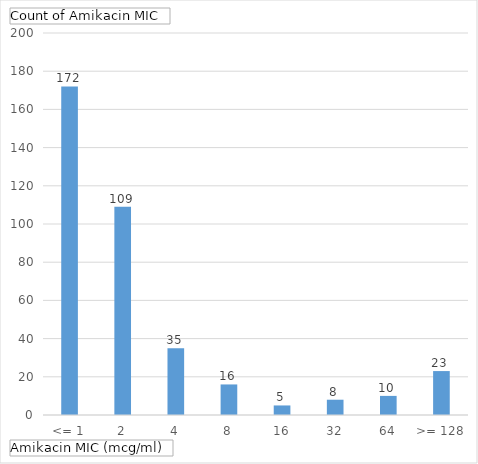
| Category | Total |
|---|---|
| <= 1 | 172 |
| 2 | 109 |
| 4 | 35 |
| 8 | 16 |
| 16 | 5 |
| 32 | 8 |
| 64 | 10 |
| >= 128 | 23 |